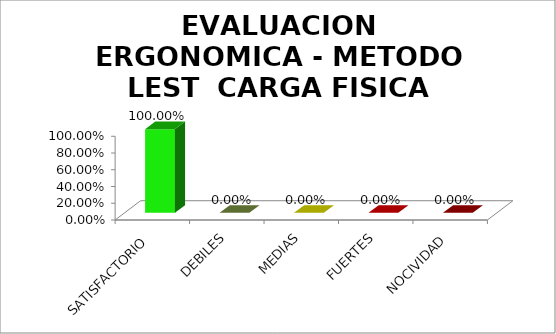
| Category | EVALUACION ERGONOMICA - METODO LEST  |
|---|---|
| SATISFACTORIO | 1 |
| DEBILES | 0 |
| MEDIAS | 0 |
| FUERTES | 0 |
| NOCIVIDAD | 0 |